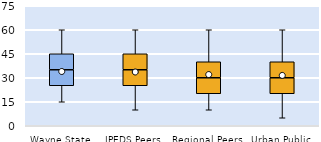
| Category | 25th | 50th | 75th |
|---|---|---|---|
| Wayne State | 25 | 10 | 10 |
| IPEDS Peers | 25 | 10 | 10 |
| Regional Peers | 20 | 10 | 10 |
| Urban Public | 20 | 10 | 10 |